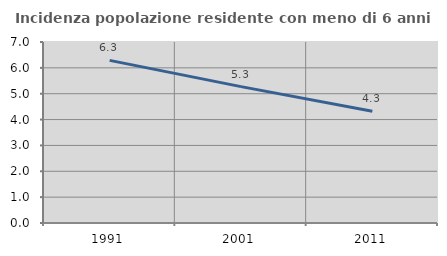
| Category | Incidenza popolazione residente con meno di 6 anni |
|---|---|
| 1991.0 | 6.289 |
| 2001.0 | 5.275 |
| 2011.0 | 4.321 |